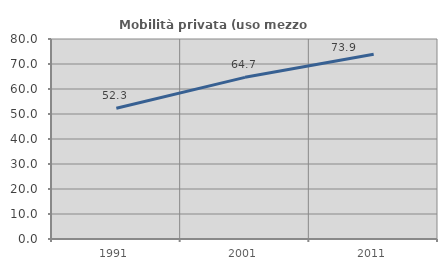
| Category | Mobilità privata (uso mezzo privato) |
|---|---|
| 1991.0 | 52.301 |
| 2001.0 | 64.665 |
| 2011.0 | 73.909 |